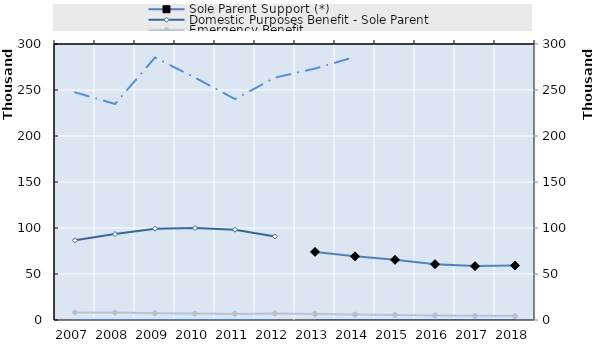
| Category | Sole Parent Support (*) | Domestic Purposes Benefit - Sole Parent | Emergency Benefit |
|---|---|---|---|
| 2007.0 | 0 | 86701 | 8275 |
| 2008.0 | 0 | 93414 | 8063 |
| 2009.0 | 0 | 99298 | 7389 |
| 2010.0 | 0 | 99962 | 6991 |
| 2011.0 | 0 | 98166 | 6644 |
| 2012.0 | 0 | 90806 | 7163 |
| 2013.0 | 74027 | 0 | 6451 |
| 2014.0 | 69241 | 0 | 5967 |
| 2015.0 | 65425 | 0 | 5487 |
| 2016.0 | 60637 | 0 | 4991 |
| 2017.0 | 58563 | 0 | 4487 |
| 2018.0 | 59267 | 0 | 4265 |